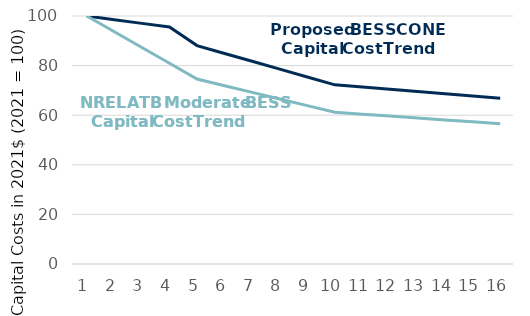
| Category | Series 0 | Series 1 |
|---|---|---|
| 0 | 100 | 100 |
| 1 | 98.5 | 93.644 |
| 2 | 97.022 | 87.288 |
| 3 | 95.567 | 80.932 |
| 4 | 88.062 | 74.576 |
| 5 | 84.896 | 71.895 |
| 6 | 81.73 | 69.214 |
| 7 | 78.564 | 66.533 |
| 8 | 75.398 | 63.852 |
| 9 | 72.232 | 61.171 |
| 10 | 71.329 | 60.406 |
| 11 | 70.426 | 59.641 |
| 12 | 69.523 | 58.877 |
| 13 | 68.621 | 58.112 |
| 14 | 67.718 | 57.348 |
| 15 | 66.815 | 56.583 |